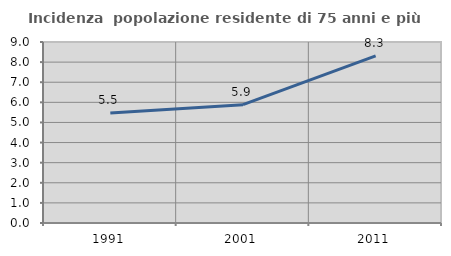
| Category | Incidenza  popolazione residente di 75 anni e più |
|---|---|
| 1991.0 | 5.475 |
| 2001.0 | 5.882 |
| 2011.0 | 8.312 |